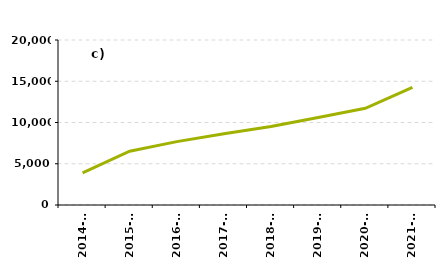
| Category | GSHP |
|---|---|
| 2014-15 | 3887 |
| 2015-16 | 6523 |
| 2016-17 | 7684 |
| 2017-18 | 8647 |
| 2018-19 | 9525 |
| 2019-20 | 10616 |
| 2020-21 | 11719 |
| 2021-22 | 14272 |